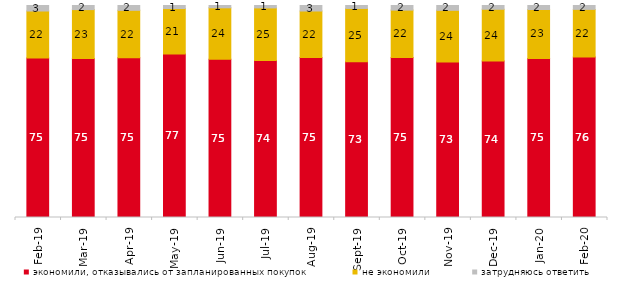
| Category | экономили, отказывались от запланированных покупок | не экономили | затрудняюсь ответить |
|---|---|---|---|
| 2019-02-01 | 75.2 | 22.2 | 2.6 |
| 2019-03-01 | 75.037 | 23.023 | 1.939 |
| 2019-04-01 | 75.297 | 22.426 | 2.277 |
| 2019-05-01 | 77.068 | 21.496 | 1.436 |
| 2019-06-01 | 74.663 | 24.239 | 1.097 |
| 2019-07-01 | 74.109 | 24.752 | 1.139 |
| 2019-08-01 | 75.425 | 21.978 | 2.597 |
| 2019-09-01 | 73.465 | 25.149 | 1.386 |
| 2019-10-01 | 75.495 | 22.327 | 2.178 |
| 2019-11-01 | 73.366 | 24.356 | 2.277 |
| 2019-12-01 | 73.861 | 24.356 | 1.782 |
| 2020-01-01 | 75.05 | 23.069 | 1.881 |
| 2020-02-01 | 75.693 | 22.475 | 1.832 |